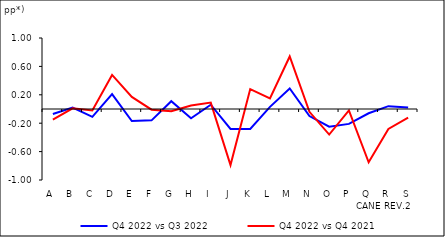
| Category | Q4 2022 vs Q3 2022 | Q4 2022 vs Q4 2021 |
|---|---|---|
| A | -0.07 | -0.15 |
| B | 0.02 | 0.01 |
| C | -0.11 | -0.02 |
| D | 0.21 | 0.48 |
| E | -0.17 | 0.17 |
| F | -0.16 | -0.01 |
| G | 0.11 | -0.03 |
| H | -0.13 | 0.05 |
| I | 0.06 | 0.09 |
| J | -0.28 | -0.79 |
| K | -0.28 | 0.28 |
| L | 0.03 | 0.15 |
| M | 0.29 | 0.74 |
| N | -0.1 | -0.04 |
| O | -0.25 | -0.36 |
| P | -0.21 | -0.02 |
| Q | -0.06 | -0.75 |
| R | 0.04 | -0.28 |
| S | 0.02 | -0.12 |